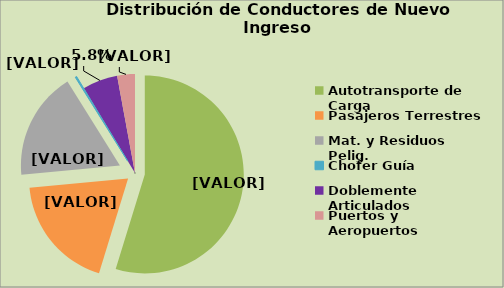
| Category | Series 0 |
|---|---|
| Autotransporte de Carga | 54.749 |
| Pasajeros Terrestres | 18.778 |
| Mat. y Residuos Pelig. | 17.581 |
| Chofer Guía | 0.247 |
| Doblemente Articulados | 5.75 |
| Puertos y Aeropuertos | 2.896 |